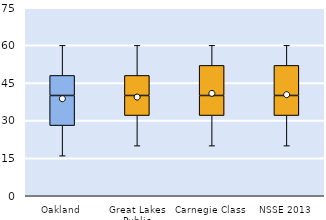
| Category | 25th | 50th | 75th |
|---|---|---|---|
| Oakland | 28 | 12 | 8 |
| Great Lakes Public | 32 | 8 | 8 |
| Carnegie Class | 32 | 8 | 12 |
| NSSE 2013 | 32 | 8 | 12 |